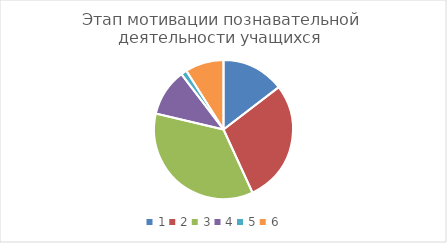
| Category | Series 0 |
|---|---|
| 0 | 0.158 |
| 1 | 0.309 |
| 2 | 0.385 |
| 3 | 0.119 |
| 4 | 0.015 |
| 5 | 0.097 |